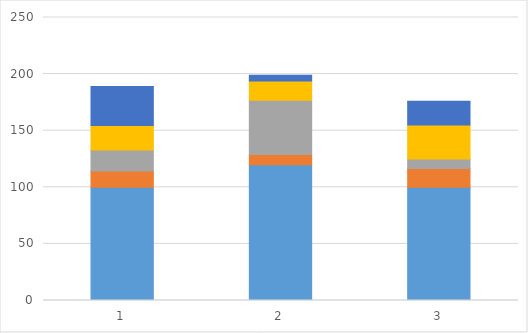
| Category | Series 0 | Series 1 | Series 2 | Series 3 | Series 4 |
|---|---|---|---|---|---|
| 0 | 100 | 14.5 | 18.5 | 21.5 | 34.5 |
| 1 | 120 | 9 | 48 | 17 | 5 |
| 2 | 100 | 16.5 | 8.5 | 30 | 21 |